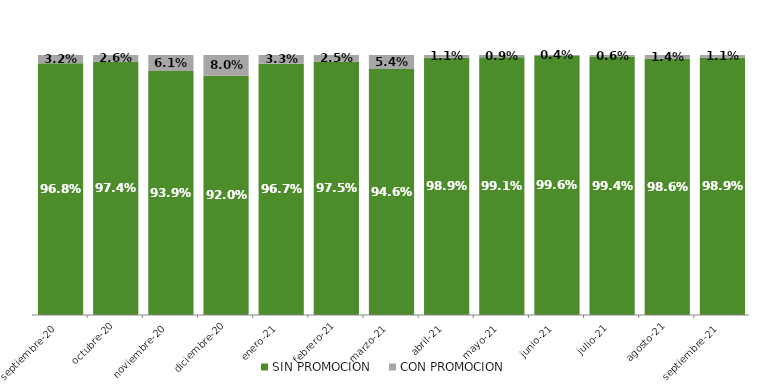
| Category | SIN PROMOCION   | CON PROMOCION   |
|---|---|---|
| 2020-09-01 | 0.968 | 0.032 |
| 2020-10-01 | 0.974 | 0.026 |
| 2020-11-01 | 0.939 | 0.061 |
| 2020-12-01 | 0.92 | 0.08 |
| 2021-01-01 | 0.967 | 0.033 |
| 2021-02-01 | 0.975 | 0.025 |
| 2021-03-01 | 0.946 | 0.054 |
| 2021-04-01 | 0.989 | 0.011 |
| 2021-05-01 | 0.991 | 0.009 |
| 2021-06-01 | 0.996 | 0.004 |
| 2021-07-01 | 0.994 | 0.006 |
| 2021-08-01 | 0.986 | 0.014 |
| 2021-09-01 | 0.989 | 0.011 |